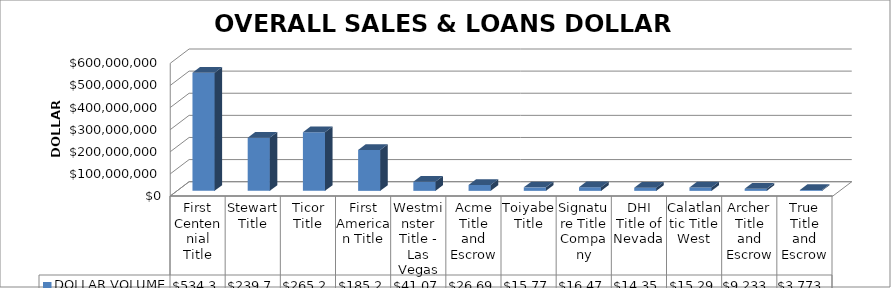
| Category | DOLLAR VOLUME |
|---|---|
| First Centennial Title | 534311752.58 |
| Stewart Title | 239746612 |
| Ticor Title | 265268368.49 |
| First American Title | 185255320.68 |
| Westminster Title - Las Vegas | 41074388 |
| Acme Title and Escrow | 26696392.97 |
| Toiyabe Title | 15772025 |
| Signature Title Company | 16471621 |
| DHI Title of Nevada | 14358584 |
| Calatlantic Title West | 15297471 |
| Archer Title and Escrow | 9233600 |
| True Title and Escrow | 3773658 |